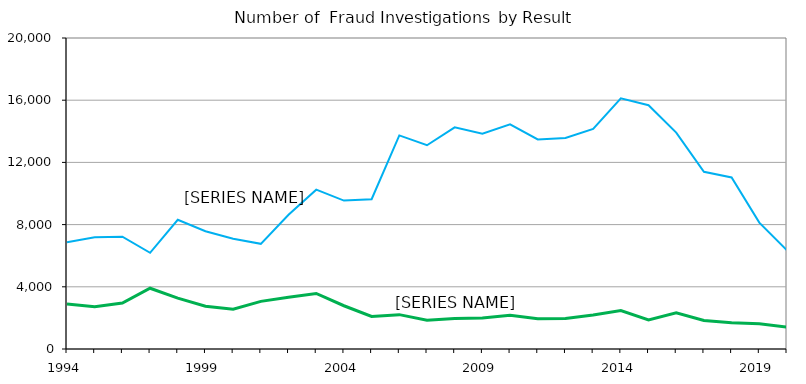
| Category | Fraud Evident | No Fraud Evident |
|---|---|---|
| 1994.0 | 2896 | 6860 |
| 1995.0 | 2724 | 7190 |
| 1996.0 | 2952 | 7223 |
| 1997.0 | 3907 | 6186 |
| 1998.0 | 3275 | 8309 |
| 1999.0 | 2750 | 7575 |
| 2000.0 | 2558 | 7088 |
| 2001.0 | 3063 | 6762 |
| 2002.0 | 3328 | 8628 |
| 2003.0 | 3574 | 10245 |
| 2004.0 | 2782 | 9544 |
| 2005.0 | 2090 | 9633 |
| 2006.0 | 2209 | 13735 |
| 2007.0 | 1857 | 13104 |
| 2008.0 | 1962 | 14256 |
| 2009.0 | 1995 | 13838 |
| 2010.0 | 2169 | 14447 |
| 2011.0 | 1946 | 13477 |
| 2012.0 | 1960 | 13572 |
| 2013.0 | 2187 | 14153 |
| 2014.0 | 2469 | 16120 |
| 2015.0 | 1871 | 15677 |
| 2016.0 | 2329 | 13917 |
| 2017.0 | 1836 | 11392 |
| 2018.0 | 1687 | 11028 |
| 2019.0 | 1624 | 8129 |
| 2020.0 | 1400 | 6339 |